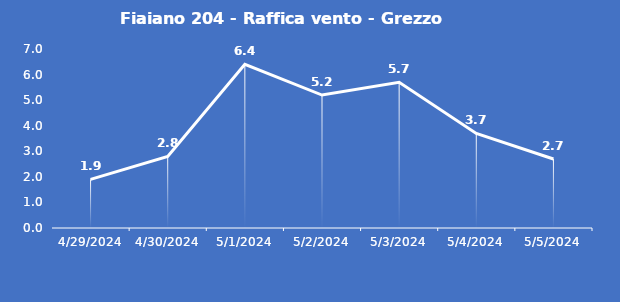
| Category | Fiaiano 204 - Raffica vento - Grezzo (m/s) |
|---|---|
| 4/29/24 | 1.9 |
| 4/30/24 | 2.8 |
| 5/1/24 | 6.4 |
| 5/2/24 | 5.2 |
| 5/3/24 | 5.7 |
| 5/4/24 | 3.7 |
| 5/5/24 | 2.7 |